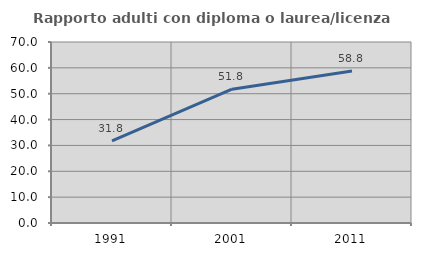
| Category | Rapporto adulti con diploma o laurea/licenza media  |
|---|---|
| 1991.0 | 31.765 |
| 2001.0 | 51.751 |
| 2011.0 | 58.788 |